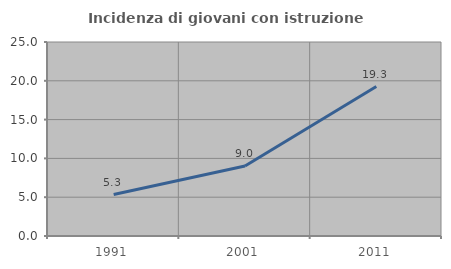
| Category | Incidenza di giovani con istruzione universitaria |
|---|---|
| 1991.0 | 5.348 |
| 2001.0 | 9.016 |
| 2011.0 | 19.259 |